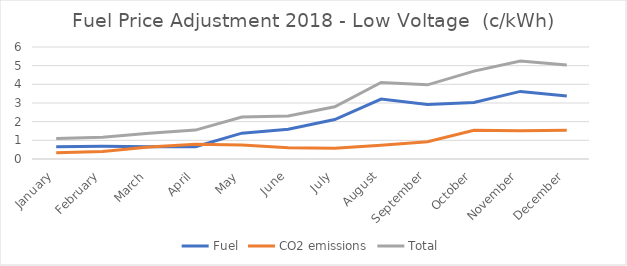
| Category | Fuel | CO2 emissions | Total |
|---|---|---|---|
| January | 0.654 | 0.335 | 1.098 |
| February | 0.679 | 0.401 | 1.17 |
| March | 0.65 | 0.64 | 1.376 |
| April | 0.653 | 0.79 | 1.547 |
| May | 1.385 | 0.745 | 2.246 |
| June | 1.591 | 0.606 | 2.307 |
| July | 2.116 | 0.571 | 2.795 |
| August | 3.213 | 0.74 | 4.099 |
| September | 2.92 | 0.929 | 3.973 |
| October | 3.031 | 1.544 | 4.71 |
| November | 3.621 | 1.514 | 5.251 |
| December | 3.38 | 1.542 | 5.03 |